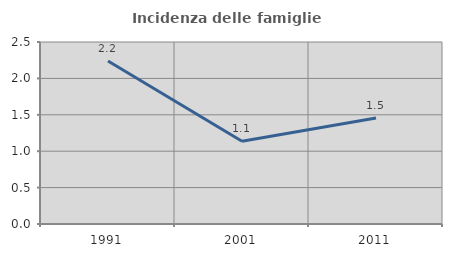
| Category | Incidenza delle famiglie numerose |
|---|---|
| 1991.0 | 2.238 |
| 2001.0 | 1.136 |
| 2011.0 | 1.456 |